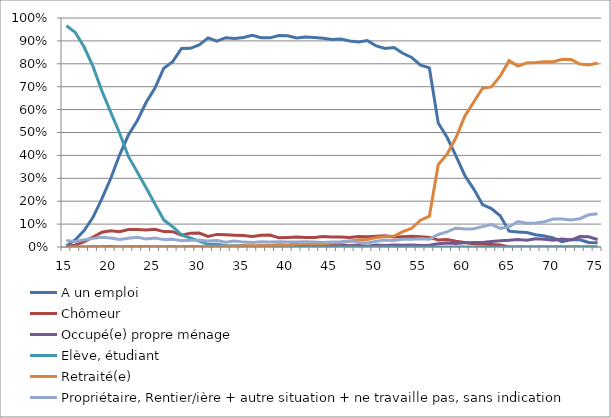
| Category | A un emploi | Chômeur | Occupé(e) propre ménage | Elève, étudiant | Retraité(e) | Propriétaire, Rentier/ière + autre situation + ne travaille pas, sans indication |
|---|---|---|---|---|---|---|
| 15.0 | 0.005 | 0 | 0 | 0.966 | 0 | 0.029 |
| 16.0 | 0.031 | 0.009 | 0 | 0.937 | 0 | 0.023 |
| 17.0 | 0.071 | 0.023 | 0 | 0.873 | 0 | 0.032 |
| 18.0 | 0.13 | 0.043 | 0.001 | 0.789 | 0 | 0.038 |
| 19.0 | 0.21 | 0.065 | 0.001 | 0.682 | 0 | 0.042 |
| 20.0 | 0.299 | 0.071 | 0.002 | 0.589 | 0 | 0.04 |
| 21.0 | 0.401 | 0.067 | 0 | 0.498 | 0 | 0.033 |
| 22.0 | 0.489 | 0.076 | 0.001 | 0.395 | 0 | 0.038 |
| 23.0 | 0.551 | 0.077 | 0.001 | 0.327 | 0.001 | 0.042 |
| 24.0 | 0.631 | 0.074 | 0.001 | 0.258 | 0 | 0.035 |
| 25.0 | 0.694 | 0.077 | 0 | 0.188 | 0.001 | 0.039 |
| 26.0 | 0.781 | 0.067 | 0.001 | 0.118 | 0.001 | 0.032 |
| 27.0 | 0.809 | 0.067 | 0.001 | 0.088 | 0.001 | 0.034 |
| 28.0 | 0.867 | 0.051 | 0 | 0.053 | 0.001 | 0.027 |
| 29.0 | 0.867 | 0.06 | 0.002 | 0.039 | 0.001 | 0.03 |
| 30.0 | 0.882 | 0.061 | 0.001 | 0.026 | 0.001 | 0.029 |
| 31.0 | 0.913 | 0.046 | 0.002 | 0.012 | 0.002 | 0.026 |
| 32.0 | 0.899 | 0.055 | 0.004 | 0.012 | 0.002 | 0.028 |
| 33.0 | 0.914 | 0.053 | 0.003 | 0.005 | 0.003 | 0.021 |
| 34.0 | 0.911 | 0.051 | 0.004 | 0.004 | 0.003 | 0.026 |
| 35.0 | 0.915 | 0.05 | 0.004 | 0.004 | 0.005 | 0.021 |
| 36.0 | 0.924 | 0.046 | 0.002 | 0.003 | 0.006 | 0.019 |
| 37.0 | 0.914 | 0.052 | 0.005 | 0.001 | 0.006 | 0.023 |
| 38.0 | 0.913 | 0.052 | 0.005 | 0.001 | 0.006 | 0.022 |
| 39.0 | 0.924 | 0.04 | 0.003 | 0.001 | 0.01 | 0.022 |
| 40.0 | 0.922 | 0.042 | 0.006 | 0.001 | 0.007 | 0.022 |
| 41.0 | 0.913 | 0.044 | 0.006 | 0.002 | 0.014 | 0.022 |
| 42.0 | 0.917 | 0.042 | 0.005 | 0 | 0.014 | 0.023 |
| 43.0 | 0.915 | 0.041 | 0.006 | 0.002 | 0.014 | 0.022 |
| 44.0 | 0.912 | 0.046 | 0.007 | 0.001 | 0.014 | 0.02 |
| 45.0 | 0.906 | 0.044 | 0.01 | 0 | 0.017 | 0.022 |
| 46.0 | 0.908 | 0.043 | 0.007 | 0 | 0.019 | 0.022 |
| 47.0 | 0.9 | 0.041 | 0.007 | 0.001 | 0.025 | 0.027 |
| 48.0 | 0.895 | 0.046 | 0.007 | 0 | 0.032 | 0.02 |
| 49.0 | 0.901 | 0.044 | 0.003 | 0 | 0.033 | 0.018 |
| 50.0 | 0.878 | 0.047 | 0.009 | 0 | 0.041 | 0.025 |
| 51.0 | 0.867 | 0.049 | 0.007 | 0.001 | 0.046 | 0.031 |
| 52.0 | 0.871 | 0.044 | 0.009 | 0 | 0.048 | 0.028 |
| 53.0 | 0.846 | 0.045 | 0.008 | 0 | 0.067 | 0.034 |
| 54.0 | 0.828 | 0.047 | 0.009 | 0 | 0.082 | 0.034 |
| 55.0 | 0.794 | 0.045 | 0.007 | 0 | 0.117 | 0.037 |
| 56.0 | 0.782 | 0.042 | 0.007 | 0 | 0.134 | 0.034 |
| 57.0 | 0.541 | 0.031 | 0.014 | 0 | 0.359 | 0.054 |
| 58.0 | 0.479 | 0.033 | 0.017 | 0 | 0.405 | 0.066 |
| 59.0 | 0.398 | 0.026 | 0.016 | 0 | 0.477 | 0.083 |
| 60.0 | 0.312 | 0.02 | 0.018 | 0 | 0.571 | 0.079 |
| 61.0 | 0.254 | 0.014 | 0.02 | 0 | 0.632 | 0.08 |
| 62.0 | 0.185 | 0.013 | 0.019 | 0 | 0.693 | 0.089 |
| 63.0 | 0.168 | 0.011 | 0.024 | 0 | 0.699 | 0.099 |
| 64.0 | 0.136 | 0.009 | 0.028 | 0 | 0.746 | 0.081 |
| 65.0 | 0.069 | 0 | 0.029 | 0 | 0.814 | 0.088 |
| 66.0 | 0.066 | 0 | 0.033 | 0 | 0.79 | 0.111 |
| 67.0 | 0.063 | 0 | 0.03 | 0 | 0.804 | 0.103 |
| 68.0 | 0.054 | 0 | 0.036 | 0 | 0.805 | 0.105 |
| 69.0 | 0.048 | 0 | 0.033 | 0 | 0.809 | 0.11 |
| 70.0 | 0.039 | 0 | 0.029 | 0 | 0.809 | 0.122 |
| 71.0 | 0.023 | 0 | 0.035 | 0 | 0.82 | 0.122 |
| 72.0 | 0.032 | 0 | 0.03 | 0 | 0.819 | 0.118 |
| 73.0 | 0.032 | 0 | 0.046 | 0 | 0.799 | 0.124 |
| 74.0 | 0.02 | 0 | 0.045 | 0 | 0.795 | 0.141 |
| 75.0 | 0.019 | 0 | 0.033 | 0 | 0.803 | 0.145 |